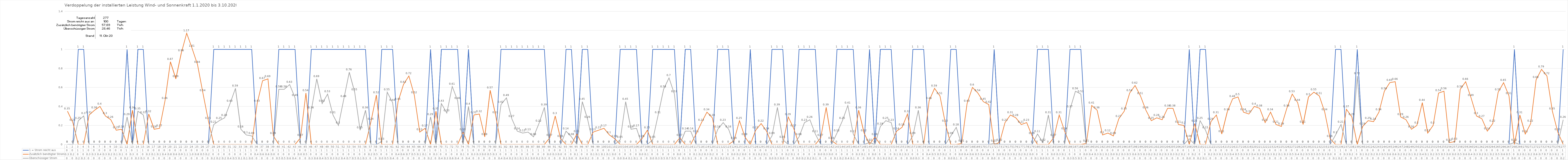
| Category | 1 = Strom reicht aus | Zusätzlich benötigter Strom | Überschüssiger Strom |
|---|---|---|---|
| 0 | 0 | 0.35 | 0 |
| 1 | 0 | 0.23 | 0 |
| 2 | 1 | 0 | 0.25 |
| 3 | 1 | 0 | 0.3 |
| 4 | 0 | 0.31 | 0 |
| 5 | 0 | 0.36 | 0 |
| 6 | 0 | 0.4 | 0 |
| 7 | 0 | 0.3 | 0 |
| 8 | 0 | 0.26 | 0 |
| 9 | 0 | 0.15 | 0 |
| 10 | 0 | 0.16 | 0 |
| 11 | 1 | 0 | 0.29 |
| 12 | 0 | 0.36 | 0 |
| 13 | 1 | 0 | 0.35 |
| 14 | 1 | 0 | 0.31 |
| 15 | 0 | 0.32 | 0 |
| 16 | 0 | 0.16 | 0 |
| 17 | 0 | 0.17 | 0 |
| 18 | 0 | 0.46 | 0 |
| 19 | 0 | 0.87 | 0 |
| 20 | 0 | 0.69 | 0 |
| 21 | 0 | 0.96 | 0 |
| 22 | 0 | 1.17 | 0 |
| 23 | 0 | 1.01 | 0 |
| 24 | 0 | 0.84 | 0 |
| 25 | 0 | 0.54 | 0 |
| 26 | 0 | 0.25 | 0 |
| 27 | 1 | 0 | 0.21 |
| 28 | 1 | 0 | 0.25 |
| 29 | 1 | 0 | 0.28 |
| 30 | 1 | 0 | 0.43 |
| 31 | 1 | 0 | 0.59 |
| 32 | 1 | 0 | 0.16 |
| 33 | 1 | 0 | 0.1 |
| 34 | 1 | 0 | 0.09 |
| 35 | 0 | 0.43 | 0 |
| 36 | 0 | 0.67 | 0 |
| 37 | 0 | 0.69 | 0 |
| 38 | 0 | 0.09 | 0 |
| 39 | 1 | 0 | 0.58 |
| 40 | 1 | 0 | 0.58 |
| 41 | 1 | 0 | 0.63 |
| 42 | 1 | 0 | 0.49 |
| 43 | 0 | 0.07 | 0 |
| 44 | 0 | 0.54 | 0 |
| 45 | 1 | 0 | 0.36 |
| 46 | 1 | 0 | 0.69 |
| 47 | 1 | 0 | 0.43 |
| 48 | 1 | 0 | 0.53 |
| 49 | 1 | 0 | 0.31 |
| 50 | 1 | 0 | 0.2 |
| 51 | 1 | 0 | 0.48 |
| 52 | 1 | 0 | 0.76 |
| 53 | 1 | 0 | 0.55 |
| 54 | 1 | 0 | 0.15 |
| 55 | 1 | 0 | 0.36 |
| 56 | 0 | 0.24 | 0 |
| 57 | 0 | 0.52 | 0 |
| 58 | 1 | 0 | 0.03 |
| 59 | 1 | 0 | 0.55 |
| 60 | 1 | 0 | 0.44 |
| 61 | 0 | 0.45 | 0 |
| 62 | 0 | 0.63 | 0 |
| 63 | 0 | 0.72 | 0 |
| 64 | 0 | 0.52 | 0 |
| 65 | 0 | 0.13 | 0 |
| 66 | 0 | 0.17 | 0 |
| 67 | 1 | 0 | 0.29 |
| 68 | 0 | 0.35 | 0 |
| 69 | 1 | 0 | 0.43 |
| 70 | 1 | 0 | 0.33 |
| 71 | 1 | 0 | 0.61 |
| 72 | 1 | 0 | 0.46 |
| 73 | 0 | 0.13 | 0 |
| 74 | 1 | 0 | 0.4 |
| 75 | 0 | 0.31 | 0 |
| 76 | 0 | 0.32 | 0 |
| 77 | 0 | 0.08 | 0 |
| 78 | 0 | 0.57 | 0 |
| 79 | 0 | 0.31 | 0 |
| 80 | 1 | 0 | 0.42 |
| 81 | 1 | 0 | 0.49 |
| 82 | 1 | 0 | 0.27 |
| 83 | 1 | 0 | 0.14 |
| 84 | 1 | 0 | 0.12 |
| 85 | 1 | 0 | 0.13 |
| 86 | 1 | 0 | 0.08 |
| 87 | 1 | 0 | 0.22 |
| 88 | 1 | 0 | 0.39 |
| 89 | 0 | 0.07 | 0 |
| 90 | 0 | 0.3 | 0 |
| 91 | 0 | 0.06 | 0 |
| 92 | 1 | 0 | 0.14 |
| 93 | 1 | 0 | 0.08 |
| 94 | 0 | 0.11 | 0 |
| 95 | 1 | 0 | 0.45 |
| 96 | 1 | 0 | 0.26 |
| 97 | 0 | 0.13 | 0 |
| 98 | 0 | 0.15 | 0 |
| 99 | 0 | 0.17 | 0 |
| 100 | 0 | 0.1 | 0 |
| 101 | 0 | 0.06 | 0 |
| 102 | 1 | 0 | 0.05 |
| 103 | 1 | 0 | 0.45 |
| 104 | 1 | 0 | 0.16 |
| 105 | 1 | 0 | 0.17 |
| 106 | 0 | 0.06 | 0 |
| 107 | 0 | 0.15 | 0 |
| 108 | 1 | 0 | 0.05 |
| 109 | 1 | 0 | 0.31 |
| 110 | 1 | 0 | 0.58 |
| 111 | 1 | 0 | 0.7 |
| 112 | 1 | 0 | 0.53 |
| 113 | 0 | 0.07 | 0 |
| 114 | 1 | 0 | 0.14 |
| 115 | 1 | 0 | 0.14 |
| 116 | 0 | 0.11 | 0 |
| 117 | 0 | 0.23 | 0 |
| 118 | 0 | 0.34 | 0 |
| 119 | 0 | 0.28 | 0 |
| 120 | 1 | 0 | 0.16 |
| 121 | 1 | 0 | 0.23 |
| 122 | 1 | 0 | 0.16 |
| 123 | 0 | 0.04 | 0 |
| 124 | 0 | 0.25 | 0 |
| 125 | 0 | 0.08 | 0 |
| 126 | 1 | 0 | 0 |
| 127 | 0 | 0.15 | 0 |
| 128 | 0 | 0.22 | 0 |
| 129 | 0 | 0.14 | 0 |
| 130 | 1 | 0 | 0.09 |
| 131 | 1 | 0 | 0.39 |
| 132 | 1 | 0 | 0.05 |
| 133 | 0 | 0.29 | 0 |
| 134 | 0 | 0.17 | 0 |
| 135 | 1 | 0 | 0.08 |
| 136 | 1 | 0 | 0.23 |
| 137 | 1 | 0 | 0.26 |
| 138 | 1 | 0 | 0.11 |
| 139 | 0 | 0.07 | 0 |
| 140 | 0 | 0.39 | 0 |
| 141 | 0 | 0.04 | 0 |
| 142 | 1 | 0 | 0.12 |
| 143 | 1 | 0 | 0.25 |
| 144 | 1 | 0 | 0.41 |
| 145 | 1 | 0 | 0.11 |
| 146 | 0 | 0.36 | 0 |
| 147 | 0 | 0.12 | 0 |
| 148 | 1 | 0 | 0.02 |
| 149 | 0 | 0.08 | 0 |
| 150 | 1 | 0 | 0.19 |
| 151 | 1 | 0 | 0.25 |
| 152 | 1 | 0 | 0.23 |
| 153 | 0 | 0.14 | 0 |
| 154 | 0 | 0.18 | 0 |
| 155 | 0 | 0.32 | 0 |
| 156 | 1 | 0 | 0.09 |
| 157 | 1 | 0 | 0.36 |
| 158 | 1 | 0 | 0 |
| 159 | 0 | 0.46 | 0 |
| 160 | 0 | 0.59 | 0 |
| 161 | 0 | 0.51 | 0 |
| 162 | 0 | 0.22 | 0 |
| 163 | 1 | 0 | 0.09 |
| 164 | 1 | 0 | 0.18 |
| 165 | 0 | 0.01 | 0 |
| 166 | 0 | 0.43 | 0 |
| 167 | 0 | 0.6 | 0 |
| 168 | 0 | 0.54 | 0 |
| 169 | 0 | 0.45 | 0 |
| 170 | 0 | 0.42 | 0 |
| 171 | 1 | 0 | 0.01 |
| 172 | 0 | 0.02 | 0 |
| 173 | 0 | 0.23 | 0 |
| 174 | 0 | 0.31 | 0 |
| 175 | 0 | 0.28 | 0 |
| 176 | 0 | 0.21 | 0 |
| 177 | 0 | 0.23 | 0 |
| 178 | 0 | 0.09 | 0 |
| 179 | 1 | 0 | 0.11 |
| 180 | 1 | 0 | 0.02 |
| 181 | 1 | 0 | 0.31 |
| 182 | 0 | 0.07 | 0 |
| 183 | 0 | 0.31 | 0 |
| 184 | 0 | 0.14 | 0 |
| 185 | 1 | 0 | 0.37 |
| 186 | 1 | 0 | 0.56 |
| 187 | 1 | 0 | 0.53 |
| 188 | 0 | 0.01 | 0 |
| 189 | 0 | 0.41 | 0 |
| 190 | 0 | 0.36 | 0 |
| 191 | 0 | 0.1 | 0 |
| 192 | 0 | 0.12 | 0 |
| 193 | 0 | 0.09 | 0 |
| 194 | 0 | 0.27 | 0 |
| 195 | 0 | 0.35 | 0 |
| 196 | 0 | 0.54 | 0 |
| 197 | 0 | 0.62 | 0 |
| 198 | 0 | 0.51 | 0 |
| 199 | 0 | 0.36 | 0 |
| 200 | 0 | 0.25 | 0 |
| 201 | 0 | 0.28 | 0 |
| 202 | 0 | 0.26 | 0 |
| 203 | 0 | 0.38 | 0 |
| 204 | 0 | 0.38 | 0 |
| 205 | 0 | 0.21 | 0 |
| 206 | 0 | 0.2 | 0 |
| 207 | 1 | 0 | 0.06 |
| 208 | 0 | 0.22 | 0 |
| 209 | 1 | 0 | 0.25 |
| 210 | 1 | 0 | 0.15 |
| 211 | 0 | 0.24 | 0 |
| 212 | 0 | 0.31 | 0 |
| 213 | 0 | 0.11 | 0 |
| 214 | 0 | 0.34 | 0 |
| 215 | 0 | 0.48 | 0 |
| 216 | 0 | 0.5 | 0 |
| 217 | 0 | 0.34 | 0 |
| 218 | 0 | 0.32 | 0 |
| 219 | 0 | 0.4 | 0 |
| 220 | 0 | 0.38 | 0 |
| 221 | 0 | 0.23 | 0 |
| 222 | 0 | 0.34 | 0 |
| 223 | 0 | 0.21 | 0 |
| 224 | 0 | 0.19 | 0 |
| 225 | 0 | 0.38 | 0 |
| 226 | 0 | 0.53 | 0 |
| 227 | 0 | 0.44 | 0 |
| 228 | 0 | 0.21 | 0 |
| 229 | 0 | 0.5 | 0 |
| 230 | 0 | 0.55 | 0 |
| 231 | 0 | 0.51 | 0 |
| 232 | 0 | 0.34 | 0 |
| 233 | 0 | 0.06 | 0 |
| 234 | 1 | 0 | 0.1 |
| 235 | 1 | 0 | 0.21 |
| 236 | 0 | 0.37 | 0 |
| 237 | 0 | 0.29 | 0 |
| 238 | 1 | 0 | 0.72 |
| 239 | 0 | 0.19 | 0 |
| 240 | 0 | 0.25 | 0 |
| 241 | 0 | 0.24 | 0 |
| 242 | 0 | 0.34 | 0 |
| 243 | 0 | 0.56 | 0 |
| 244 | 0 | 0.65 | 0 |
| 245 | 0 | 0.66 | 0 |
| 246 | 0 | 0.29 | 0 |
| 247 | 0 | 0.26 | 0 |
| 248 | 0 | 0.16 | 0 |
| 249 | 0 | 0.2 | 0 |
| 250 | 0 | 0.44 | 0 |
| 251 | 0 | 0.12 | 0 |
| 252 | 0 | 0.2 | 0 |
| 253 | 0 | 0.54 | 0 |
| 254 | 0 | 0.56 | 0 |
| 255 | 0 | 0.02 | 0 |
| 256 | 0 | 0.03 | 0 |
| 257 | 0 | 0.58 | 0 |
| 258 | 0 | 0.66 | 0 |
| 259 | 0 | 0.49 | 0 |
| 260 | 0 | 0.3 | 0 |
| 261 | 0 | 0.27 | 0 |
| 262 | 0 | 0.14 | 0 |
| 263 | 0 | 0.22 | 0 |
| 264 | 0 | 0.55 | 0 |
| 265 | 0 | 0.65 | 0 |
| 266 | 0 | 0.51 | 0 |
| 267 | 1 | 0 | 0.02 |
| 268 | 0 | 0.31 | 0 |
| 269 | 0 | 0.11 | 0 |
| 270 | 0 | 0.22 | 0 |
| 271 | 0 | 0.68 | 0 |
| 272 | 0 | 0.79 | 0 |
| 273 | 0 | 0.72 | 0 |
| 274 | 0 | 0.35 | 0 |
| 275 | 0 | 0.13 | 0 |
| 276 | 1 | 0 | 0.26 |